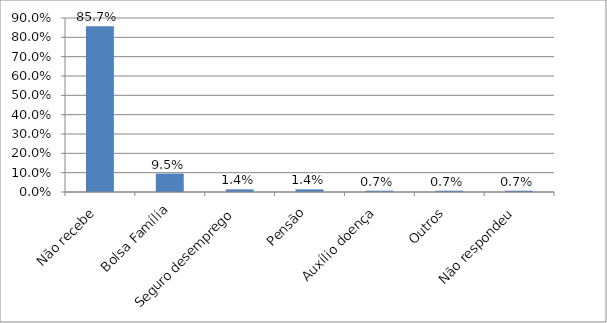
| Category | Series 0 |
|---|---|
| Não recebe | 0.857 |
| Bolsa Família | 0.095 |
| Seguro desemprego | 0.014 |
| Pensão | 0.014 |
| Auxílio doença | 0.007 |
| Outros | 0.007 |
| Não respondeu | 0.007 |